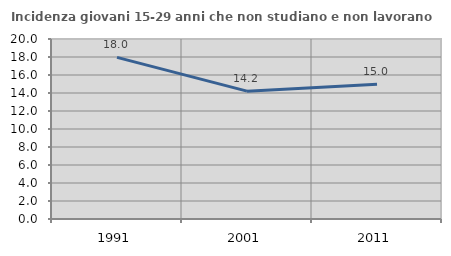
| Category | Incidenza giovani 15-29 anni che non studiano e non lavorano  |
|---|---|
| 1991.0 | 17.956 |
| 2001.0 | 14.206 |
| 2011.0 | 14.974 |